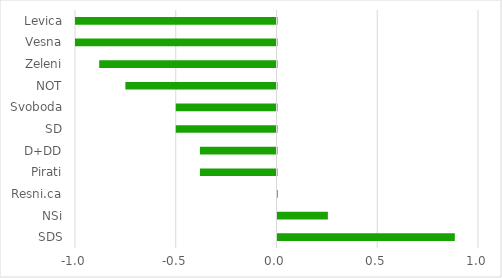
| Category | Series 0 |
|---|---|
| SDS | 0.88 |
| NSi | 0.25 |
| Resni.ca | 0.001 |
| Pirati | -0.38 |
| D+DD | -0.38 |
| SD | -0.5 |
| Svoboda | -0.5 |
| NOT | -0.75 |
| Zeleni | -0.88 |
| Vesna | -1 |
| Levica | -1 |